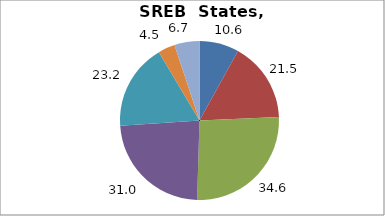
| Category | Series 0 |
|---|---|
| Higher Education | 10.629 |
| Elementary and Secondary Education | 21.494 |
| Total Education1 | 34.572 |
| Social Welfare2 | 31.011 |
| Transportation, Public Safety, Environment and Housing3 | 23.155 |
| Administration | 4.527 |
| Other4 | 6.735 |